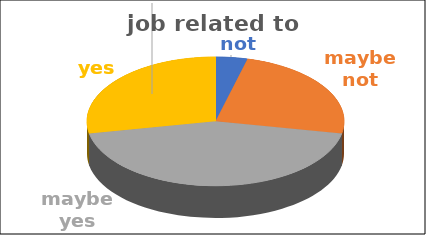
| Category | job related to studies | Series 1 | Series 2 | Series 3 | Series 4 |
|---|---|---|---|---|---|
| not | 0.04 |  |  |  |  |
| maybe not | 0.24 |  |  |  |  |
| maybe yes | 0.44 |  |  |  |  |
| yes | 0.28 |  |  |  |  |